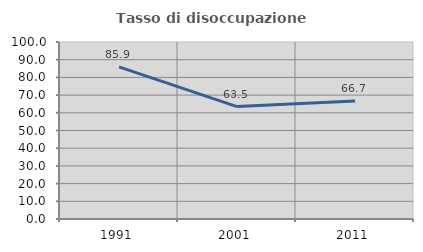
| Category | Tasso di disoccupazione giovanile  |
|---|---|
| 1991.0 | 85.938 |
| 2001.0 | 63.492 |
| 2011.0 | 66.667 |